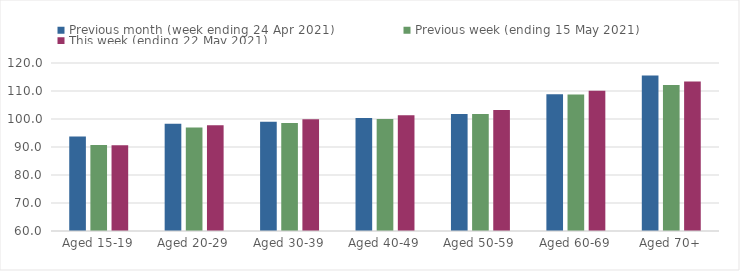
| Category | Previous month (week ending 24 Apr 2021) | Previous week (ending 15 May 2021) | This week (ending 22 May 2021) |
|---|---|---|---|
| Aged 15-19 | 93.75 | 90.72 | 90.65 |
| Aged 20-29 | 98.32 | 97 | 97.74 |
| Aged 30-39 | 98.98 | 98.58 | 99.89 |
| Aged 40-49 | 100.33 | 99.96 | 101.35 |
| Aged 50-59 | 101.81 | 101.82 | 103.19 |
| Aged 60-69 | 108.84 | 108.78 | 110.13 |
| Aged 70+ | 115.57 | 112.1 | 113.38 |